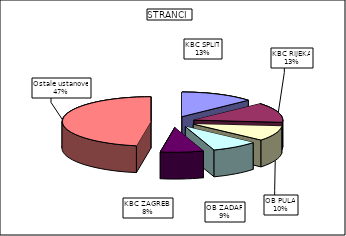
| Category | Series 0 |
|---|---|
| KBC SPLIT | 13.418 |
| KBC RIJEKA | 13.037 |
| OB PULA | 9.747 |
| OB ZADAR | 8.559 |
| KBC ZAGREB  | 7.843 |
| Ostale ustanove | 47.396 |